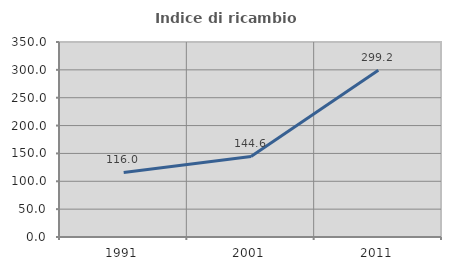
| Category | Indice di ricambio occupazionale  |
|---|---|
| 1991.0 | 115.971 |
| 2001.0 | 144.568 |
| 2011.0 | 299.222 |